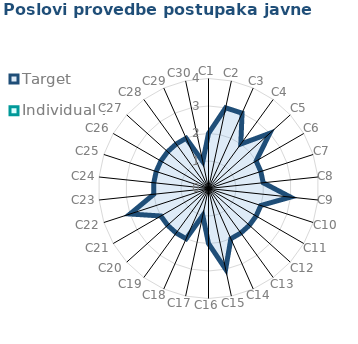
| Category | Target | Individual 1 |
|---|---|---|
| C1 | 2 | 0 |
| C2 | 3 | 0 |
| C3 | 3 | 0 |
| C4 | 2 | 0 |
| C5 | 3 | 0 |
| C6 | 2 | 0 |
| C7 | 2 | 0 |
| C8 | 2 | 0 |
| C9 | 3 | 0 |
| C10 | 2 | 0 |
| C11 | 2 | 0 |
| C12 | 2 | 0 |
| C13 | 2 | 0 |
| C14 | 2 | 0 |
| C15 | 3 | 0 |
| C16 | 2 | 0 |
| C17 | 1 | 0 |
| C18 | 2 | 0 |
| C19 | 2 | 0 |
| C20 | 2 | 0 |
| C21 | 2 | 0 |
| C22 | 3 | 0 |
| C23 | 2 | 0 |
| C24 | 2 | 0 |
| C25 | 2 | 0 |
| C26 | 2 | 0 |
| C27 | 2 | 0 |
| C28 | 2 | 0 |
| C29 | 2 | 0 |
| C30 | 1 | 0 |